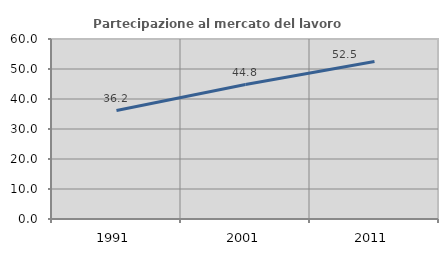
| Category | Partecipazione al mercato del lavoro  femminile |
|---|---|
| 1991.0 | 36.162 |
| 2001.0 | 44.832 |
| 2011.0 | 52.516 |